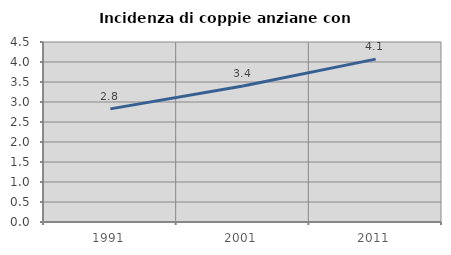
| Category | Incidenza di coppie anziane con figli |
|---|---|
| 1991.0 | 2.828 |
| 2001.0 | 3.399 |
| 2011.0 | 4.072 |